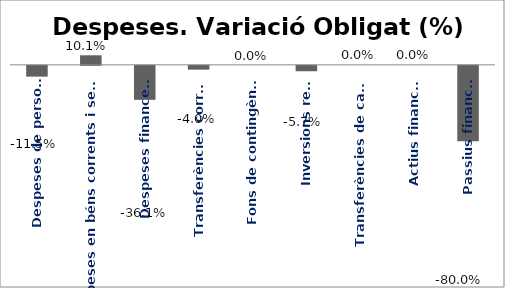
| Category | Series 0 |
|---|---|
| Despeses de personal | -0.115 |
| Despeses en béns corrents i serveis | 0.101 |
| Despeses financeres | -0.361 |
| Transferències corrents | -0.04 |
| Fons de contingència | 0 |
| Inversions reals | -0.057 |
| Transferències de capital | 0 |
| Actius financers | 0 |
| Passius financers | -0.8 |